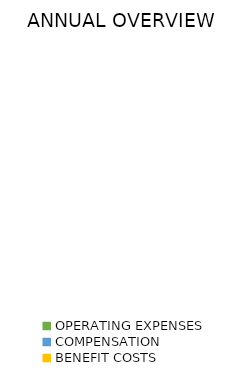
| Category | ANNUAL |
|---|---|
| OPERATING EXPENSES | 0 |
| COMPENSATION | 0 |
| BENEFIT COSTS | 0 |